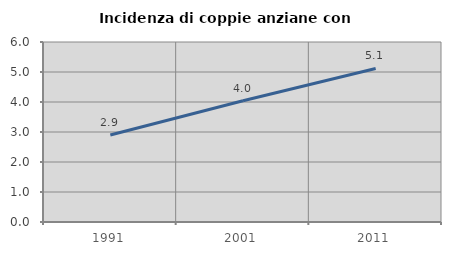
| Category | Incidenza di coppie anziane con figli |
|---|---|
| 1991.0 | 2.899 |
| 2001.0 | 4.043 |
| 2011.0 | 5.117 |